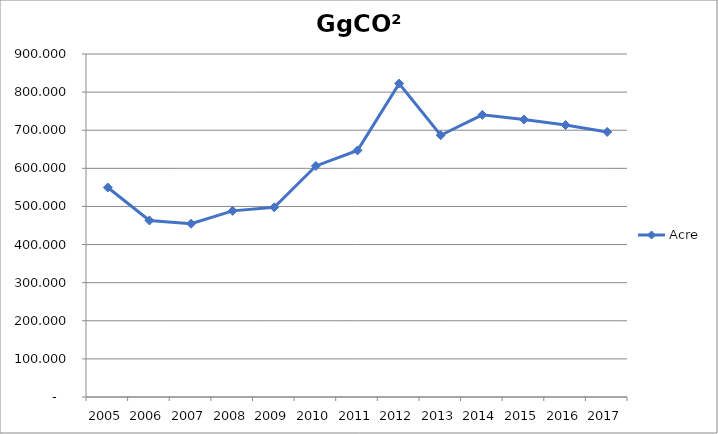
| Category | Acre |
|---|---|
| 2005.0 | 549.746 |
| 2006.0 | 463.31 |
| 2007.0 | 454.648 |
| 2008.0 | 488.416 |
| 2009.0 | 497.779 |
| 2010.0 | 606.314 |
| 2011.0 | 646.919 |
| 2012.0 | 822.36 |
| 2013.0 | 686.878 |
| 2014.0 | 740.298 |
| 2015.0 | 727.96 |
| 2016.0 | 713.558 |
| 2017.0 | 695.552 |